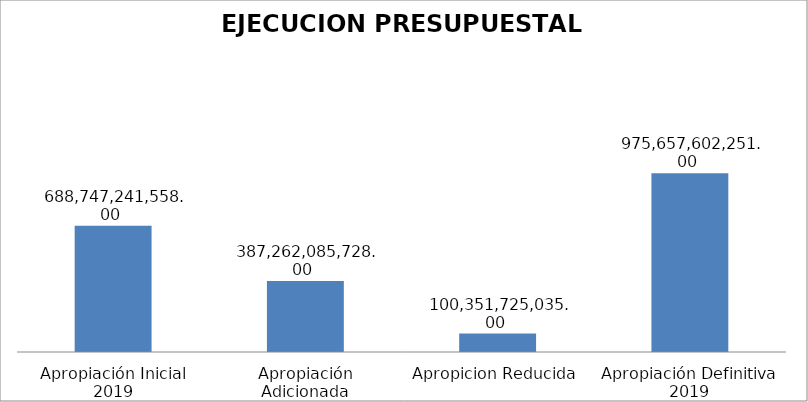
| Category | Series 0 |  688.747.241.558,00  |
|---|---|---|
| Apropiación Inicial 2019 | 688747241558 |  |
| Apropiación Adicionada | 387262085728 |  |
| Apropicion Reducida | 100351725035 |  |
| Apropiación Definitiva 2019 | 975657602251 |  |